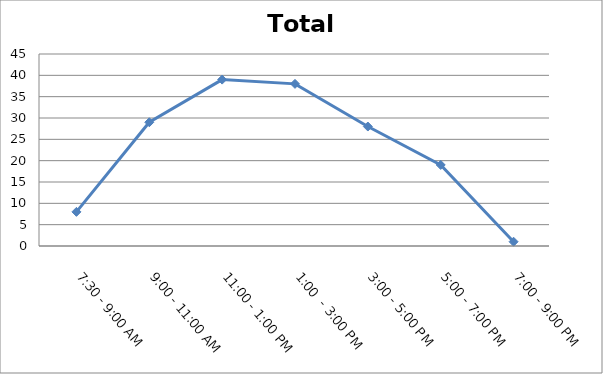
| Category | Total |
|---|---|
| 7:30 - 9:00 AM | 8 |
| 9:00 - 11:00 AM | 29 |
| 11:00 - 1:00 PM | 39 |
| 1:00  - 3:00 PM | 38 |
| 3:00 - 5:00 PM | 28 |
| 5:00 - 7:00 PM | 19 |
| 7:00 - 9:00 PM | 1 |